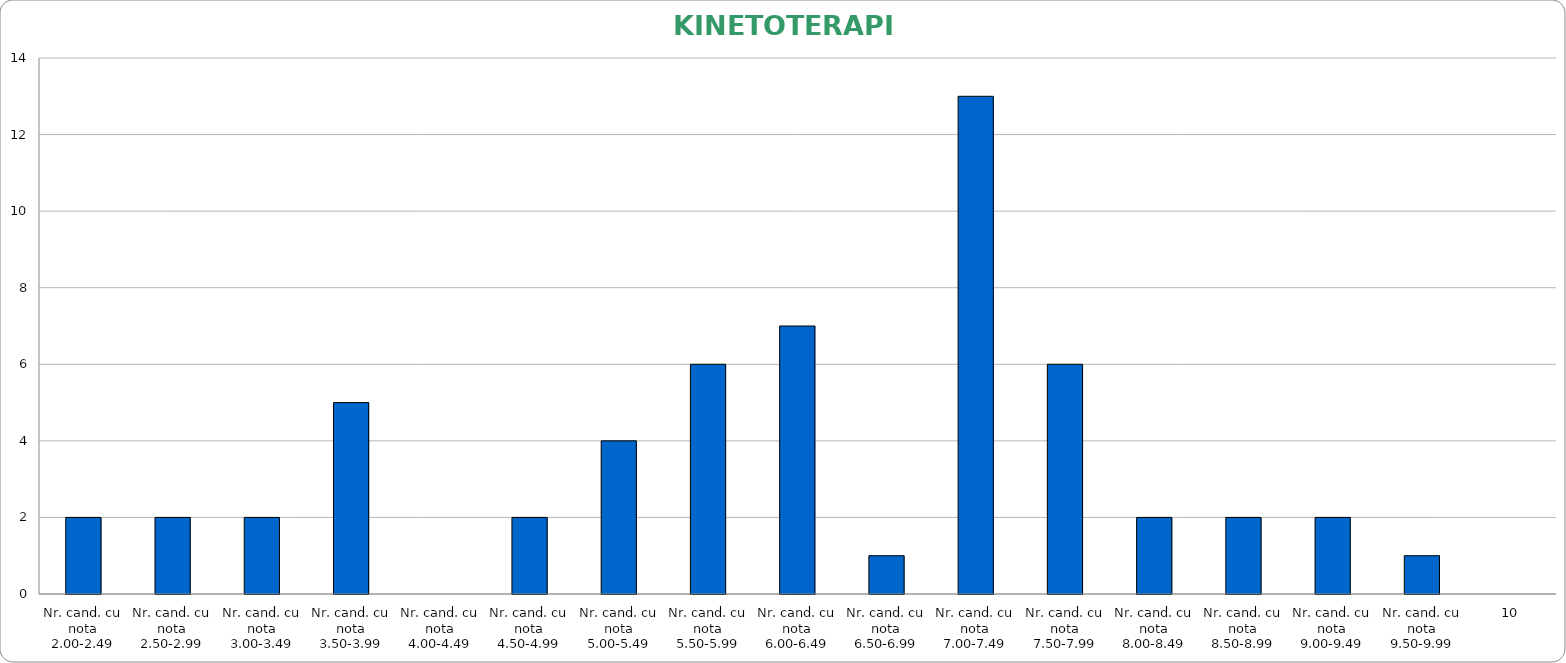
| Category | Series 0 |
|---|---|
| Nr. cand. cu nota 2.00-2.49 | 2 |
| Nr. cand. cu nota 2.50-2.99 | 2 |
| Nr. cand. cu nota 3.00-3.49 | 2 |
| Nr. cand. cu nota 3.50-3.99 | 5 |
| Nr. cand. cu nota 4.00-4.49 | 0 |
| Nr. cand. cu nota 4.50-4.99 | 2 |
| Nr. cand. cu nota 5.00-5.49 | 4 |
| Nr. cand. cu nota 5.50-5.99 | 6 |
| Nr. cand. cu nota 6.00-6.49 | 7 |
| Nr. cand. cu nota 6.50-6.99 | 1 |
| Nr. cand. cu nota 7.00-7.49 | 13 |
| Nr. cand. cu nota 7.50-7.99 | 6 |
| Nr. cand. cu nota 8.00-8.49 | 2 |
| Nr. cand. cu nota 8.50-8.99 | 2 |
| Nr. cand. cu nota 9.00-9.49 | 2 |
| Nr. cand. cu nota 9.50-9.99 | 1 |
| 10 | 0 |